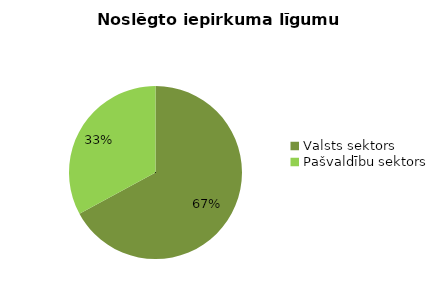
| Category | Noslēgto iepirkuma līgumu skaits |
|---|---|
| Valsts sektors | 363 |
| Pašvaldību sektors | 178 |